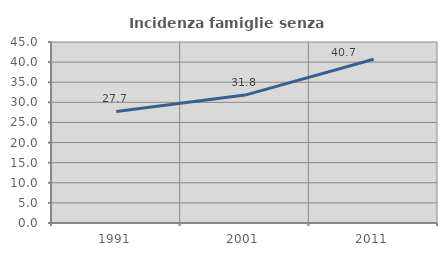
| Category | Incidenza famiglie senza nuclei |
|---|---|
| 1991.0 | 27.728 |
| 2001.0 | 31.801 |
| 2011.0 | 40.722 |